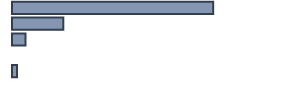
| Category | Series 0 |
|---|---|
| 0 | 74.236 |
| 1 | 18.934 |
| 2 | 4.977 |
| 3 | 0 |
| 4 | 1.852 |